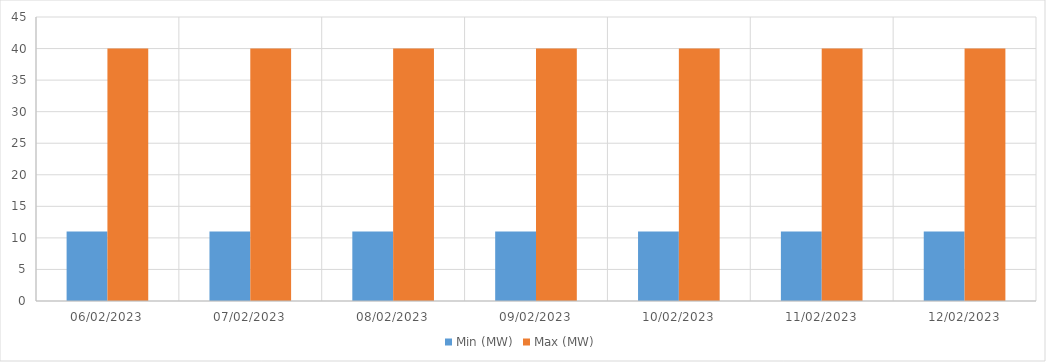
| Category | Min (MW) | Max (MW) |
|---|---|---|
| 06/02/2023 | 11 | 40 |
| 07/02/2023 | 11 | 40 |
| 08/02/2023 | 11 | 40 |
| 09/02/2023 | 11 | 40 |
| 10/02/2023 | 11 | 40 |
| 11/02/2023 | 11 | 40 |
| 12/02/2023 | 11 | 40 |